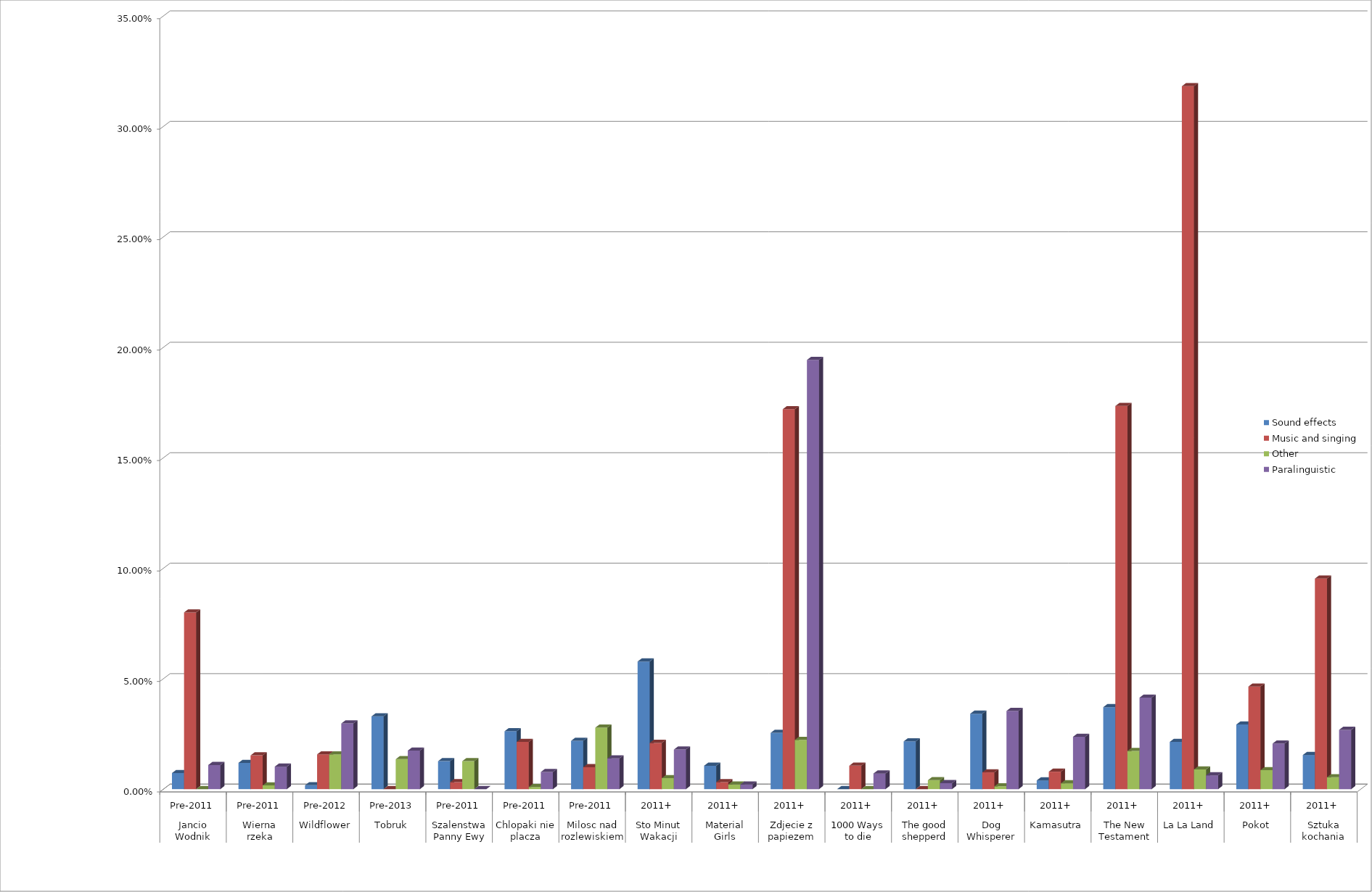
| Category | Sound effects | Music and singing | Other | Paralinguistic |
|---|---|---|---|---|
| 0 | 0.007 | 0.08 | 0 | 0.011 |
| 1 | 0.012 | 0.015 | 0.002 | 0.01 |
| 2 | 0.002 | 0.016 | 0.016 | 0.03 |
| 3 | 0.033 | 0 | 0.014 | 0.017 |
| 4 | 0.013 | 0.003 | 0.013 | 0 |
| 5 | 0.026 | 0.021 | 0.001 | 0.008 |
| 6 | 0.022 | 0.01 | 0.028 | 0.014 |
| 7 | 0.058 | 0.021 | 0.005 | 0.018 |
| 8 | 0.011 | 0.003 | 0.002 | 0.002 |
| 9 | 0.025 | 0.172 | 0.022 | 0.194 |
| 10 | 0 | 0.011 | 0 | 0.007 |
| 11 | 0.022 | 0 | 0.004 | 0.003 |
| 12 | 0.034 | 0.008 | 0.001 | 0.035 |
| 13 | 0.004 | 0.008 | 0.003 | 0.024 |
| 14 | 0.037 | 0.173 | 0.017 | 0.041 |
| 15 | 0.021 | 0.318 | 0.009 | 0.006 |
| 16 | 0.029 | 0.046 | 0.009 | 0.021 |
| 17 | 0.015 | 0.095 | 0.005 | 0.027 |